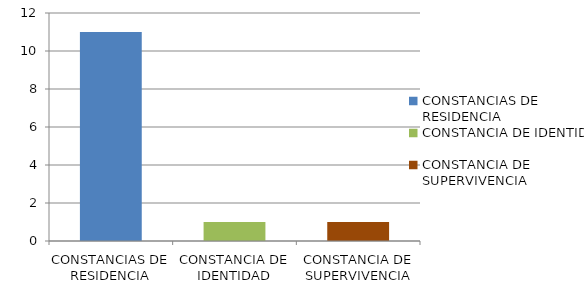
| Category | Series 0 |
|---|---|
| CONSTANCIAS DE RESIDENCIA | 11 |
| CONSTANCIA DE IDENTIDAD | 1 |
| CONSTANCIA DE SUPERVIVENCIA | 1 |